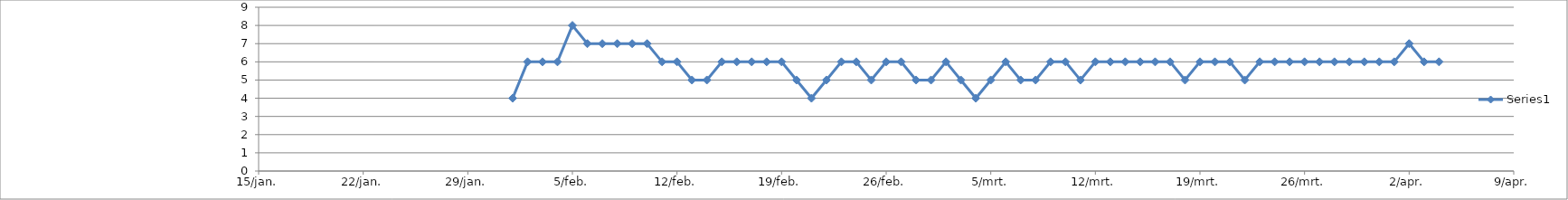
| Category | Series 0 |
|---|---|
| 44599.0 | 4 |
| 44600.0 | 6 |
| 44601.0 | 6 |
| 44602.0 | 6 |
| 44603.0 | 8 |
| 44604.0 | 7 |
| 44605.0 | 7 |
| 44606.0 | 7 |
| 44607.0 | 7 |
| 44608.0 | 7 |
| 44609.0 | 6 |
| 44610.0 | 6 |
| 44611.0 | 5 |
| 44612.0 | 5 |
| 44613.0 | 6 |
| 44614.0 | 6 |
| 44615.0 | 6 |
| 44616.0 | 6 |
| 44617.0 | 6 |
| 44618.0 | 5 |
| 44619.0 | 4 |
| 44620.0 | 5 |
| 44621.0 | 6 |
| 44622.0 | 6 |
| 44623.0 | 5 |
| 44624.0 | 6 |
| 44625.0 | 6 |
| 44626.0 | 5 |
| 44627.0 | 5 |
| 44628.0 | 6 |
| 44629.0 | 5 |
| 44630.0 | 4 |
| 44631.0 | 5 |
| 44632.0 | 6 |
| 44633.0 | 5 |
| 44634.0 | 5 |
| 44635.0 | 6 |
| 44636.0 | 6 |
| 44637.0 | 5 |
| 44638.0 | 6 |
| 44639.0 | 6 |
| 44640.0 | 6 |
| 44641.0 | 6 |
| 44642.0 | 6 |
| 44643.0 | 6 |
| 44644.0 | 5 |
| 44645.0 | 6 |
| 44646.0 | 6 |
| 44647.0 | 6 |
| 44648.0 | 5 |
| 44649.0 | 6 |
| 44650.0 | 6 |
| 44651.0 | 6 |
| 44652.0 | 6 |
| 44653.0 | 6 |
| 44654.0 | 6 |
| 44655.0 | 6 |
| 44656.0 | 6 |
| 44657.0 | 6 |
| 44658.0 | 6 |
| 44659.0 | 7 |
| 44660.0 | 6 |
| 44661.0 | 6 |